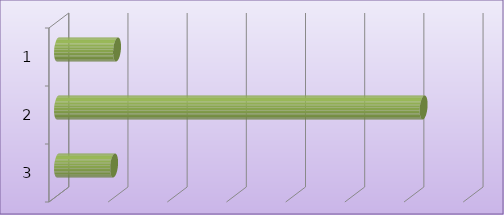
| Category | Series 0 |
|---|---|
| 0 | 9979041 |
| 1 | 61784060 |
| 2 | 9480000 |